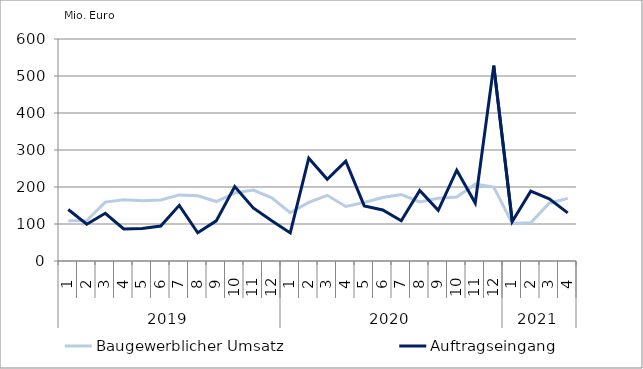
| Category | Baugewerblicher Umsatz | Auftragseingang |
|---|---|---|
| 0 | 108616.605 | 139065.287 |
| 1 | 109331.58 | 99318.609 |
| 2 | 159117.81 | 129002.041 |
| 3 | 165654.287 | 86579.2 |
| 4 | 162976.056 | 87644.362 |
| 5 | 165026.188 | 94463.186 |
| 6 | 178622.938 | 150345.08 |
| 7 | 176074.101 | 76434.317 |
| 8 | 160663.041 | 108444.162 |
| 9 | 183589.485 | 201122.697 |
| 10 | 191777.213 | 143514.792 |
| 11 | 170885.223 | 108780.022 |
| 12 | 130445.562 | 75891.481 |
| 13 | 158433.655 | 277923.85 |
| 14 | 177529.832 | 220973.626 |
| 15 | 147259.799 | 269936.091 |
| 16 | 157965.891 | 149072.895 |
| 17 | 171647.778 | 137984.76 |
| 18 | 179530.732 | 108645.965 |
| 19 | 159480.457 | 190771.468 |
| 20 | 169638.111 | 136988.906 |
| 21 | 173040.053 | 245341.603 |
| 22 | 207619.085 | 156647.224 |
| 23 | 199947.086 | 528166.004 |
| 24 | 101295.895 | 106850.127 |
| 25 | 103236.543 | 188883.434 |
| 26 | 156172.725 | 168204.42 |
| 27 | 169257.088 | 130052.073 |